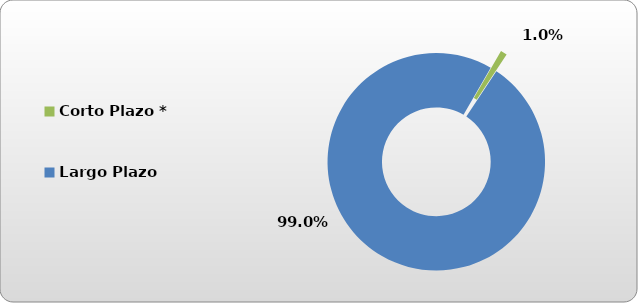
| Category | Corto Plazo * |
|---|---|
| Corto Plazo * | 5409.123 |
| Largo Plazo | 553205.499 |